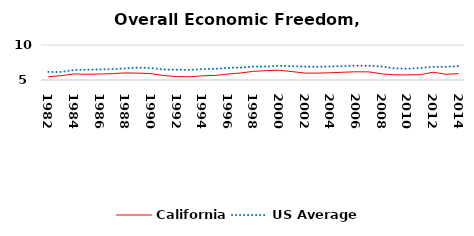
| Category | California | US Average |
|---|---|---|
| 1982.0 | 5.468 | 6.149 |
| 1983.0 | 5.62 | 6.152 |
| 1984.0 | 5.869 | 6.429 |
| 1985.0 | 5.818 | 6.464 |
| 1986.0 | 5.855 | 6.512 |
| 1987.0 | 5.912 | 6.552 |
| 1988.0 | 6.017 | 6.659 |
| 1989.0 | 5.979 | 6.767 |
| 1990.0 | 5.924 | 6.71 |
| 1991.0 | 5.638 | 6.502 |
| 1992.0 | 5.493 | 6.463 |
| 1993.0 | 5.456 | 6.446 |
| 1994.0 | 5.596 | 6.563 |
| 1995.0 | 5.645 | 6.593 |
| 1996.0 | 5.856 | 6.73 |
| 1997.0 | 6.004 | 6.781 |
| 1998.0 | 6.235 | 6.926 |
| 1999.0 | 6.34 | 6.925 |
| 2000.0 | 6.398 | 7.031 |
| 2001.0 | 6.202 | 6.969 |
| 2002.0 | 5.991 | 6.912 |
| 2003.0 | 5.985 | 6.892 |
| 2004.0 | 6.032 | 6.934 |
| 2005.0 | 6.112 | 6.99 |
| 2006.0 | 6.17 | 7.048 |
| 2007.0 | 6.159 | 7.028 |
| 2008.0 | 5.878 | 6.935 |
| 2009.0 | 5.737 | 6.668 |
| 2010.0 | 5.726 | 6.605 |
| 2011.0 | 5.755 | 6.72 |
| 2012.0 | 6.112 | 6.883 |
| 2013.0 | 5.82 | 6.881 |
| 2014.0 | 5.91 | 6.973 |